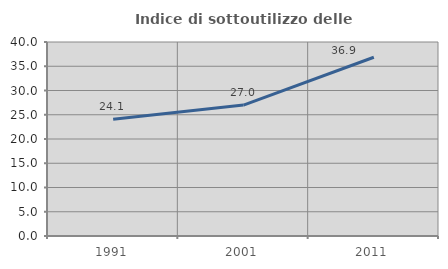
| Category | Indice di sottoutilizzo delle abitazioni  |
|---|---|
| 1991.0 | 24.091 |
| 2001.0 | 27.002 |
| 2011.0 | 36.859 |